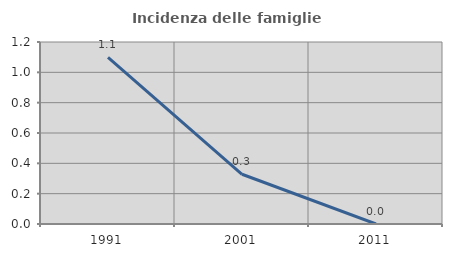
| Category | Incidenza delle famiglie numerose |
|---|---|
| 1991.0 | 1.099 |
| 2001.0 | 0.328 |
| 2011.0 | 0 |